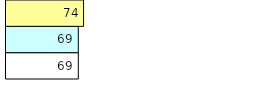
| Category | Total Standouts | Total Recd | Total Tipsters |
|---|---|---|---|
| 0 | 69 | 69 | 74 |